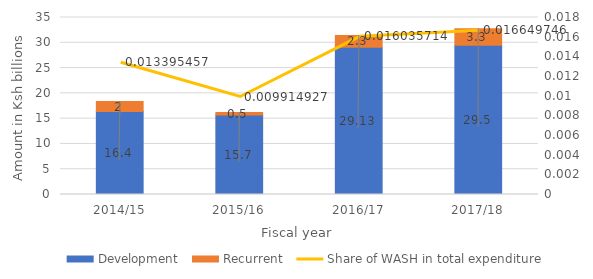
| Category | Development  | Recurrent  |
|---|---|---|
| 2014/15 | 16.4 | 2 |
| 2015/16 | 15.7 | 0.5 |
| 2016/17 | 29.13 | 2.3 |
| 2017/18 | 29.5 | 3.3 |